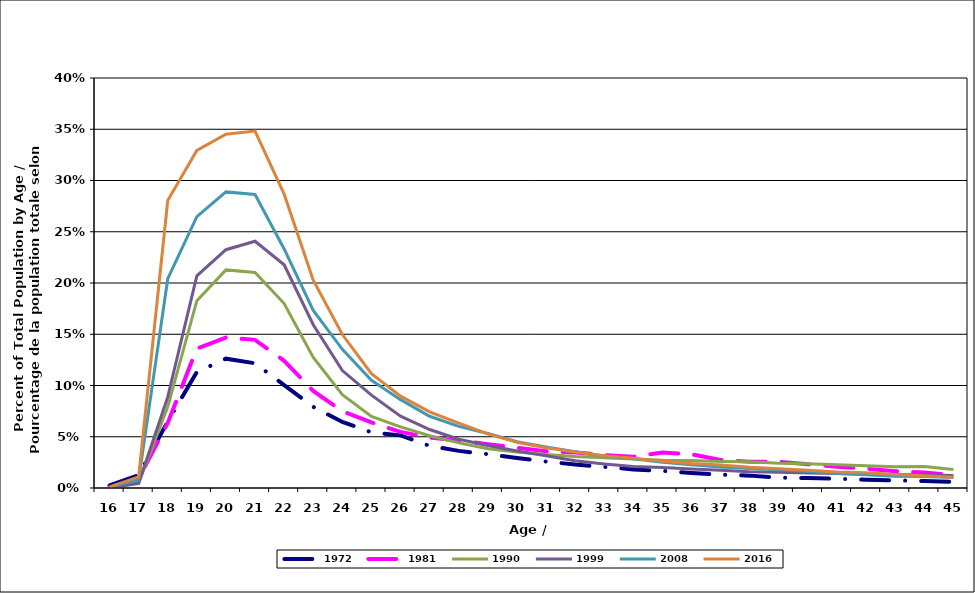
| Category | 1972 | 1981 | 1990 | 1999 | 2008 | 2016 |
|---|---|---|---|---|---|---|
| 16.0 | 0.002 | 0.001 | 0 | 0 | 0.001 | 0.001 |
| 17.0 | 0.013 | 0.009 | 0.005 | 0.005 | 0.008 | 0.011 |
| 18.0 | 0.065 | 0.063 | 0.079 | 0.089 | 0.204 | 0.28 |
| 19.0 | 0.113 | 0.136 | 0.183 | 0.207 | 0.265 | 0.329 |
| 20.0 | 0.126 | 0.147 | 0.213 | 0.232 | 0.289 | 0.345 |
| 21.0 | 0.122 | 0.145 | 0.21 | 0.241 | 0.286 | 0.348 |
| 22.0 | 0.1 | 0.124 | 0.18 | 0.218 | 0.233 | 0.287 |
| 23.0 | 0.079 | 0.095 | 0.127 | 0.159 | 0.173 | 0.203 |
| 24.0 | 0.064 | 0.075 | 0.091 | 0.115 | 0.135 | 0.15 |
| 25.0 | 0.054 | 0.064 | 0.07 | 0.091 | 0.105 | 0.112 |
| 26.0 | 0.051 | 0.055 | 0.06 | 0.07 | 0.086 | 0.09 |
| 27.0 | 0.041 | 0.049 | 0.051 | 0.057 | 0.07 | 0.074 |
| 28.0 | 0.036 | 0.046 | 0.044 | 0.048 | 0.06 | 0.063 |
| 29.0 | 0.033 | 0.043 | 0.038 | 0.041 | 0.053 | 0.053 |
| 30.0 | 0.029 | 0.039 | 0.035 | 0.036 | 0.045 | 0.045 |
| 31.0 | 0.026 | 0.036 | 0.033 | 0.031 | 0.04 | 0.039 |
| 32.0 | 0.023 | 0.035 | 0.031 | 0.027 | 0.035 | 0.035 |
| 33.0 | 0.021 | 0.032 | 0.029 | 0.024 | 0.031 | 0.031 |
| 34.0 | 0.018 | 0.03 | 0.028 | 0.021 | 0.029 | 0.029 |
| 35.0 | 0.017 | 0.035 | 0.027 | 0.02 | 0.025 | 0.026 |
| 36.0 | 0.015 | 0.033 | 0.027 | 0.019 | 0.023 | 0.024 |
| 37.0 | 0.013 | 0.027 | 0.026 | 0.017 | 0.02 | 0.023 |
| 38.0 | 0.012 | 0.026 | 0.026 | 0.016 | 0.019 | 0.02 |
| 39.0 | 0.01 | 0.026 | 0.024 | 0.015 | 0.018 | 0.019 |
| 40.0 | 0.01 | 0.023 | 0.024 | 0.015 | 0.016 | 0.017 |
| 41.0 | 0.009 | 0.021 | 0.023 | 0.014 | 0.014 | 0.016 |
| 42.0 | 0.008 | 0.019 | 0.022 | 0.014 | 0.013 | 0.015 |
| 43.0 | 0.007 | 0.016 | 0.021 | 0.013 | 0.011 | 0.013 |
| 44.0 | 0.007 | 0.015 | 0.021 | 0.013 | 0.011 | 0.012 |
| 45.0 | 0.006 | 0.013 | 0.018 | 0.012 | 0.01 | 0.01 |